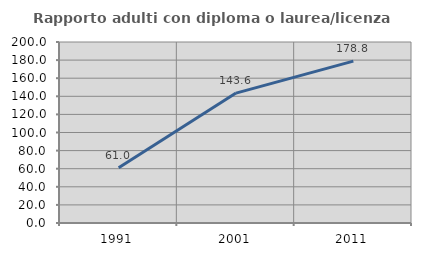
| Category | Rapporto adulti con diploma o laurea/licenza media  |
|---|---|
| 1991.0 | 61.039 |
| 2001.0 | 143.564 |
| 2011.0 | 178.846 |